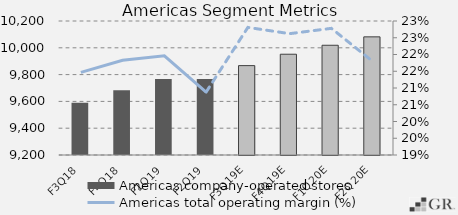
| Category | Americas company-operated stores |
|---|---|
|  F3Q18  | 9590 |
|  F4Q18  | 9684 |
|  F1Q19  | 9768 |
|  F2Q19  | 9767 |
|  F3Q19E  | 9867 |
|  F4Q19E  | 9952 |
|  F1Q20E  | 10019 |
|  F2Q20E  | 10081.75 |